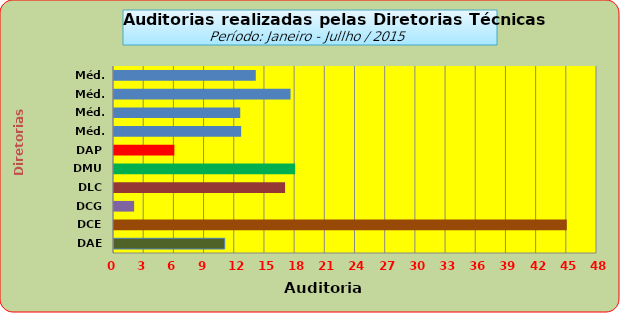
| Category | Series 0 |
|---|---|
| DAE | 11 |
| DCE | 45 |
| DCG | 2 |
| DLC | 17 |
| DMU | 18 |
| DAP | 6 |
| Méd. 2011 | 12.636 |
| Méd. 2012 | 12.545 |
| Méd. 2013 | 17.545 |
| Méd. 2014 | 14.091 |